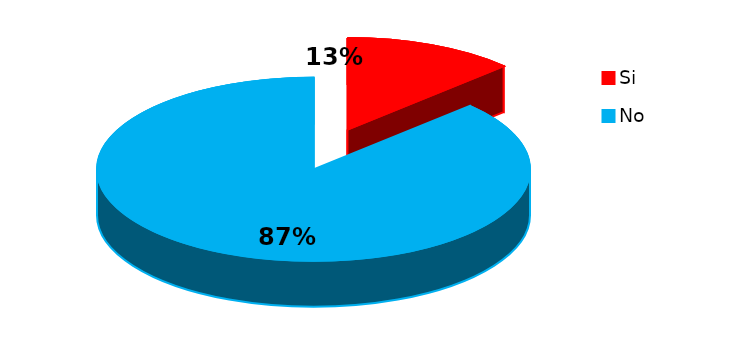
| Category | Series 0 |
|---|---|
| 0 | 5 |
| 1 | 34 |